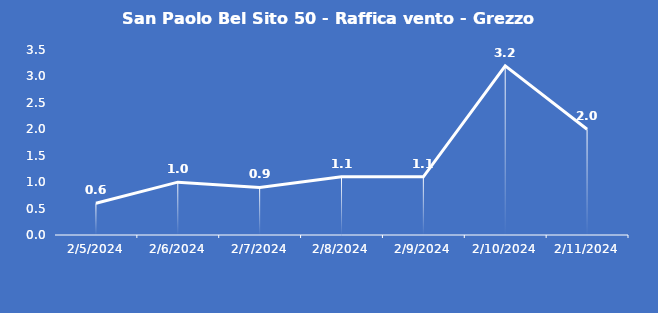
| Category | San Paolo Bel Sito 50 - Raffica vento - Grezzo (m/s) |
|---|---|
| 2/5/24 | 0.6 |
| 2/6/24 | 1 |
| 2/7/24 | 0.9 |
| 2/8/24 | 1.1 |
| 2/9/24 | 1.1 |
| 2/10/24 | 3.2 |
| 2/11/24 | 2 |